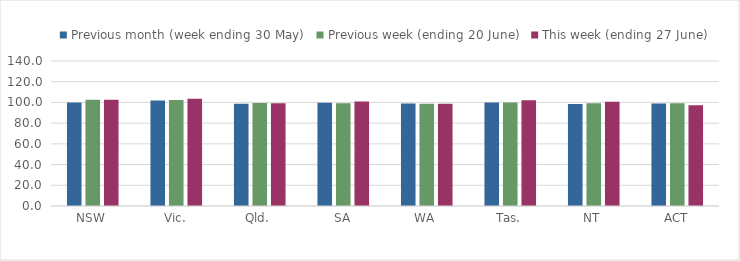
| Category | Previous month (week ending 30 May) | Previous week (ending 20 June) | This week (ending 27 June) |
|---|---|---|---|
| NSW | 99.828 | 102.649 | 102.649 |
| Vic. | 101.892 | 102.337 | 103.584 |
| Qld. | 98.799 | 99.386 | 99.253 |
| SA | 99.691 | 99.17 | 100.855 |
| WA | 99.042 | 98.676 | 98.676 |
| Tas. | 100 | 99.964 | 102.148 |
| NT | 98.517 | 99.166 | 100.582 |
| ACT | 98.942 | 99.153 | 97.251 |